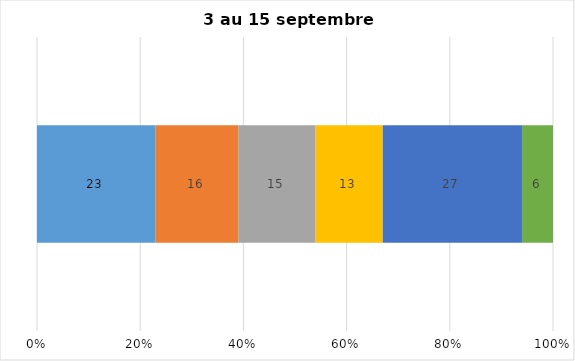
| Category | Plusieurs fois par jour | Une fois par jour | Quelques fois par semaine   | Une fois par semaine ou moins   |  Jamais   |  Je n’utilise pas les médias sociaux |
|---|---|---|---|---|---|---|
| 0 | 23 | 16 | 15 | 13 | 27 | 6 |